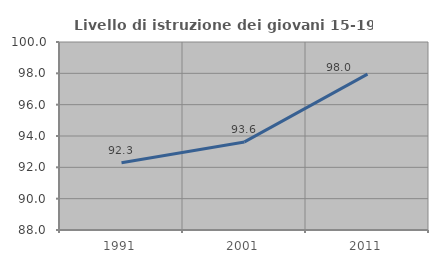
| Category | Livello di istruzione dei giovani 15-19 anni |
|---|---|
| 1991.0 | 92.292 |
| 2001.0 | 93.623 |
| 2011.0 | 97.953 |